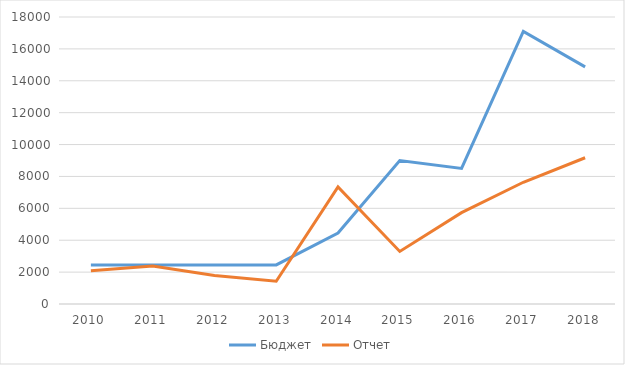
| Category | Бюджет | Отчет |
|---|---|---|
| 2010.0 | 2450 | 2086.497 |
| 2011.0 | 2450 | 2389.709 |
| 2012.0 | 2450 | 1782.903 |
| 2013.0 | 2450 | 1429.225 |
| 2014.0 | 4450 | 7336.611 |
| 2015.0 | 9000 | 3296.327 |
| 2016.0 | 8500 | 5726.993 |
| 2017.0 | 17094 | 7636.035 |
| 2018.0 | 14870 | 9171.304 |